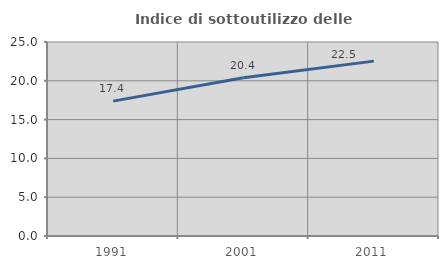
| Category | Indice di sottoutilizzo delle abitazioni  |
|---|---|
| 1991.0 | 17.38 |
| 2001.0 | 20.401 |
| 2011.0 | 22.534 |